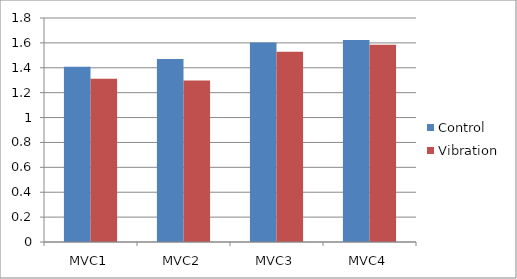
| Category | Control | Vibration |
|---|---|---|
| MVC1 | 1.408 | 1.312 |
| MVC2 | 1.471 | 1.298 |
| MVC3 | 1.603 | 1.53 |
| MVC4 | 1.624 | 1.586 |